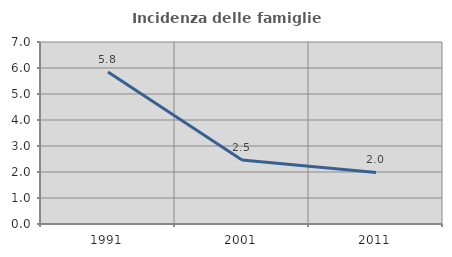
| Category | Incidenza delle famiglie numerose |
|---|---|
| 1991.0 | 5.845 |
| 2001.0 | 2.459 |
| 2011.0 | 1.981 |